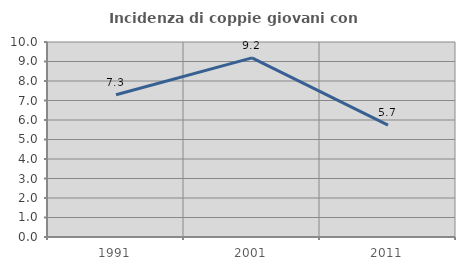
| Category | Incidenza di coppie giovani con figli |
|---|---|
| 1991.0 | 7.292 |
| 2001.0 | 9.185 |
| 2011.0 | 5.735 |